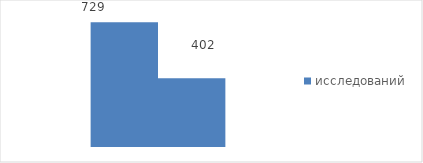
| Category | исследований |
|---|---|
| 0 | 402 |